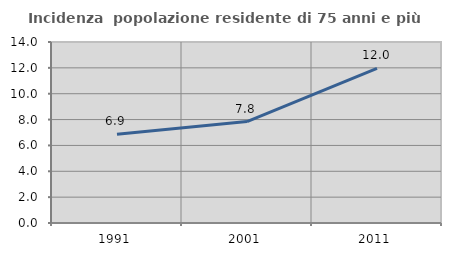
| Category | Incidenza  popolazione residente di 75 anni e più |
|---|---|
| 1991.0 | 6.867 |
| 2001.0 | 7.849 |
| 2011.0 | 11.952 |